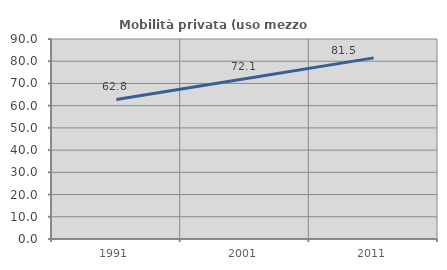
| Category | Mobilità privata (uso mezzo privato) |
|---|---|
| 1991.0 | 62.812 |
| 2001.0 | 72.105 |
| 2011.0 | 81.508 |